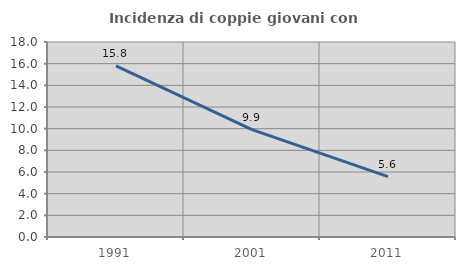
| Category | Incidenza di coppie giovani con figli |
|---|---|
| 1991.0 | 15.792 |
| 2001.0 | 9.918 |
| 2011.0 | 5.58 |